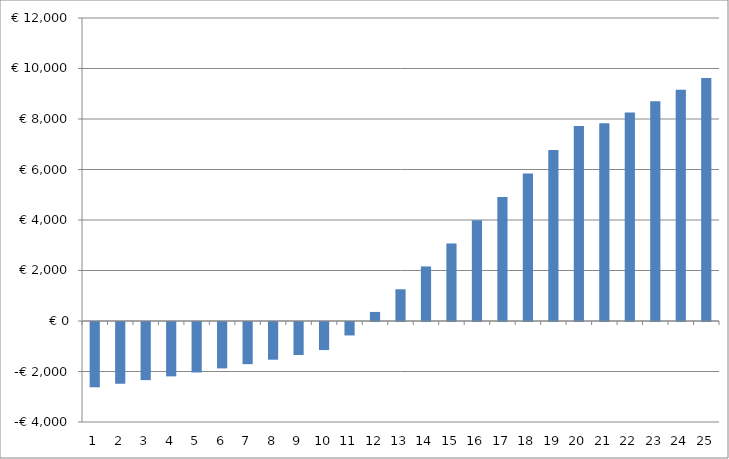
| Category | Series 0 |
|---|---|
| 0 | -234.116 |
| 1 | -455.828 |
| 2 | -673.417 |
| 3 | -886.123 |
| 4 | -1093.15 |
| 5 | -1293.657 |
| 6 | -1486.759 |
| 7 | -1671.527 |
| 8 | -1846.979 |
| 9 | -2012.083 |
| 10 | -1433.259 |
| 11 | -541.852 |
| 12 | 356.194 |
| 13 | 1259.842 |
| 14 | 2169.417 |
| 15 | 3085.252 |
| 16 | 4007.682 |
| 17 | 4937.055 |
| 18 | 5873.723 |
| 19 | 6818.045 |
| 20 | 6931.954 |
| 21 | 7359.108 |
| 22 | 7799.845 |
| 23 | 8254.516 |
| 24 | 8723.477 |